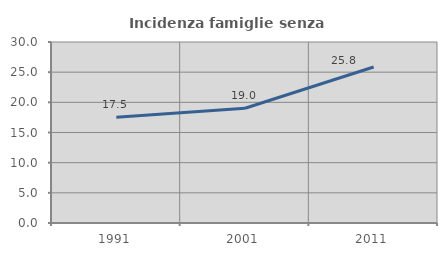
| Category | Incidenza famiglie senza nuclei |
|---|---|
| 1991.0 | 17.547 |
| 2001.0 | 19.025 |
| 2011.0 | 25.848 |